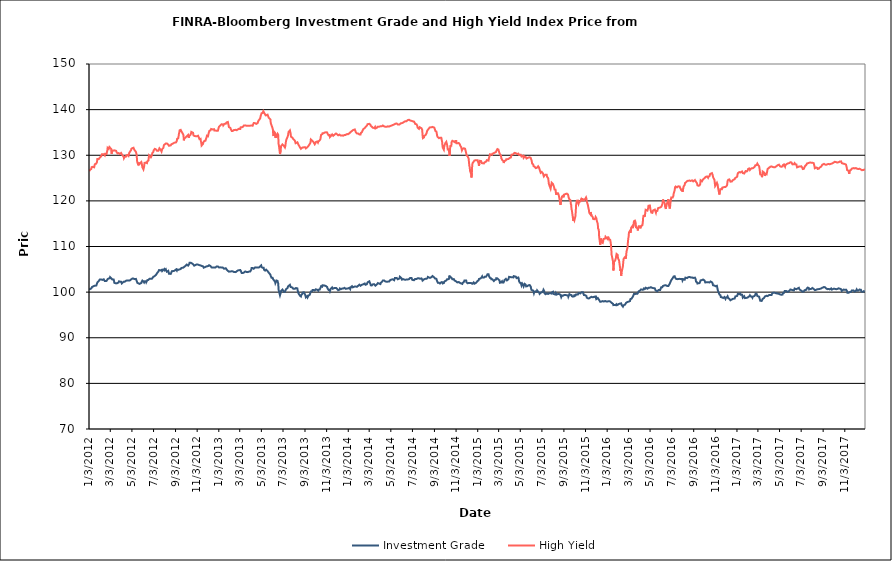
| Category | Investment Grade | High Yield |
|---|---|---|
| 1/3/12 | 100.742 | 126.521 |
| 1/4/12 | 100.597 | 126.529 |
| 1/5/12 | 100.548 | 126.663 |
| 1/6/12 | 100.672 | 126.824 |
| 1/9/12 | 100.818 | 127.016 |
| 1/10/12 | 100.91 | 127.393 |
| 1/11/12 | 101.119 | 127.414 |
| 1/12/12 | 101.246 | 127.571 |
| 1/13/12 | 101.324 | 127.463 |
| 1/17/12 | 101.365 | 127.36 |
| 1/18/12 | 101.455 | 127.435 |
| 1/19/12 | 101.448 | 128.026 |
| 1/20/12 | 101.421 | 128.07 |
| 1/23/12 | 101.433 | 128.175 |
| 1/24/12 | 101.349 | 128.221 |
| 1/25/12 | 101.65 | 128.487 |
| 1/26/12 | 102.102 | 129.167 |
| 1/27/12 | 102.266 | 129.213 |
| 1/30/12 | 102.431 | 129.164 |
| 1/31/12 | 102.58 | 129.039 |
| 2/1/12 | 102.574 | 129.405 |
| 2/2/12 | 102.767 | 129.511 |
| 2/3/12 | 102.65 | 129.574 |
| 2/6/12 | 102.774 | 129.798 |
| 2/7/12 | 102.668 | 129.809 |
| 2/8/12 | 102.826 | 130.217 |
| 2/9/12 | 102.679 | 130.377 |
| 2/10/12 | 102.743 | 130.002 |
| 2/13/12 | 102.811 | 130.239 |
| 2/14/12 | 102.821 | 130.083 |
| 2/15/12 | 102.83 | 130.106 |
| 2/16/12 | 102.429 | 129.967 |
| 2/17/12 | 102.479 | 130.307 |
| 2/21/12 | 102.463 | 130.284 |
| 2/22/12 | 102.57 | 130.67 |
| 2/23/12 | 102.664 | 130.956 |
| 2/24/12 | 102.855 | 131.597 |
| 2/27/12 | 103.004 | 131.368 |
| 2/28/12 | 103.144 | 131.529 |
| 2/29/12 | 103.205 | 131.808 |
| 3/1/12 | 103.025 | 131.852 |
| 3/2/12 | 103.284 | 131.736 |
| 3/5/12 | 103.056 | 131.389 |
| 3/6/12 | 102.929 | 130.339 |
| 3/7/12 | 102.889 | 130.576 |
| 3/8/12 | 102.775 | 130.669 |
| 3/9/12 | 102.69 | 131.049 |
| 3/12/12 | 102.756 | 131.049 |
| 3/13/12 | 102.485 | 131.146 |
| 3/14/12 | 102.022 | 131.244 |
| 3/15/12 | 101.978 | 131.069 |
| 3/16/12 | 102.017 | 131.099 |
| 3/19/12 | 101.918 | 130.958 |
| 3/20/12 | 101.786 | 130.727 |
| 3/21/12 | 102.027 | 130.902 |
| 3/22/12 | 101.958 | 130.559 |
| 3/23/12 | 102.123 | 130.411 |
| 3/26/12 | 102.121 | 130.481 |
| 3/27/12 | 102.364 | 130.583 |
| 3/28/12 | 102.343 | 130.551 |
| 3/29/12 | 102.348 | 130.289 |
| 3/30/12 | 102.304 | 130.504 |
| 4/2/12 | 102.275 | 130.507 |
| 4/3/12 | 102.178 | 130.54 |
| 4/4/12 | 101.896 | 130.313 |
| 4/5/12 | 101.959 | 130.066 |
| 4/9/12 | 102.29 | 129.724 |
| 4/10/12 | 102.336 | 129.341 |
| 4/11/12 | 102.227 | 129.316 |
| 4/12/12 | 102.258 | 129.646 |
| 4/13/12 | 102.438 | 129.816 |
| 4/16/12 | 102.512 | 129.715 |
| 4/17/12 | 102.447 | 129.998 |
| 4/18/12 | 102.478 | 130.062 |
| 4/19/12 | 102.542 | 130 |
| 4/20/12 | 102.456 | 130.072 |
| 4/23/12 | 102.528 | 129.844 |
| 4/24/12 | 102.45 | 130.122 |
| 4/25/12 | 102.376 | 130.54 |
| 4/26/12 | 102.526 | 130.61 |
| 4/27/12 | 102.624 | 130.774 |
| 4/30/12 | 102.764 | 131.097 |
| 5/1/12 | 102.747 | 131.422 |
| 5/2/12 | 102.891 | 131.549 |
| 5/3/12 | 102.958 | 131.559 |
| 5/4/12 | 103.036 | 131.564 |
| 5/7/12 | 102.967 | 131.646 |
| 5/8/12 | 103.069 | 131.43 |
| 5/9/12 | 102.922 | 131.22 |
| 5/10/12 | 102.853 | 131.368 |
| 5/11/12 | 102.937 | 131.343 |
| 5/14/12 | 102.896 | 130.719 |
| 5/15/12 | 102.777 | 130.618 |
| 5/16/12 | 102.436 | 130.036 |
| 5/17/12 | 102.22 | 128.787 |
| 5/18/12 | 102.02 | 128.397 |
| 5/21/12 | 101.935 | 127.807 |
| 5/22/12 | 101.836 | 128.404 |
| 5/23/12 | 101.909 | 128.029 |
| 5/24/12 | 101.806 | 128.076 |
| 5/25/12 | 101.934 | 128.245 |
| 5/29/12 | 102 | 128.512 |
| 5/30/12 | 102.241 | 128.252 |
| 5/31/12 | 102.454 | 128.088 |
| 6/1/12 | 102.529 | 127.354 |
| 6/4/12 | 102.342 | 126.898 |
| 6/5/12 | 102.151 | 126.694 |
| 6/6/12 | 102.104 | 127.566 |
| 6/7/12 | 102.302 | 128.314 |
| 6/8/12 | 102.404 | 128.144 |
| 6/11/12 | 102.405 | 128.406 |
| 6/12/12 | 102.158 | 128.202 |
| 6/13/12 | 102.242 | 128.297 |
| 6/14/12 | 102.219 | 128.278 |
| 6/15/12 | 102.624 | 128.671 |
| 6/18/12 | 102.678 | 128.831 |
| 6/19/12 | 102.678 | 129.471 |
| 6/20/12 | 102.731 | 129.982 |
| 6/21/12 | 102.928 | 130.01 |
| 6/22/12 | 102.86 | 129.877 |
| 6/25/12 | 102.926 | 129.569 |
| 6/26/12 | 102.827 | 129.662 |
| 6/27/12 | 102.871 | 129.855 |
| 6/28/12 | 102.95 | 129.949 |
| 6/29/12 | 102.908 | 130.465 |
| 7/2/12 | 103.372 | 130.772 |
| 7/3/12 | 103.438 | 131.071 |
| 7/5/12 | 103.483 | 131.238 |
| 7/6/12 | 103.617 | 131.405 |
| 7/9/12 | 103.743 | 131.298 |
| 7/10/12 | 103.882 | 131.313 |
| 7/11/12 | 103.974 | 131.355 |
| 7/12/12 | 104.078 | 130.988 |
| 7/13/12 | 104.213 | 131.017 |
| 7/16/12 | 104.502 | 130.976 |
| 7/17/12 | 104.542 | 130.994 |
| 7/18/12 | 104.84 | 131.143 |
| 7/19/12 | 104.904 | 131.518 |
| 7/20/12 | 104.869 | 131.357 |
| 7/23/12 | 104.76 | 131.103 |
| 7/24/12 | 104.857 | 130.931 |
| 7/25/12 | 104.856 | 130.805 |
| 7/26/12 | 104.899 | 131.091 |
| 7/27/12 | 104.627 | 131.355 |
| 7/30/12 | 104.84 | 131.604 |
| 7/31/12 | 105.028 | 131.948 |
| 8/1/12 | 104.967 | 132.255 |
| 8/2/12 | 105.058 | 132.124 |
| 8/3/12 | 104.808 | 132.261 |
| 8/6/12 | 105.018 | 132.559 |
| 8/7/12 | 104.746 | 132.745 |
| 8/8/12 | 104.638 | 132.59 |
| 8/9/12 | 104.469 | 132.581 |
| 8/10/12 | 104.646 | 132.362 |
| 8/13/12 | 104.659 | 132.342 |
| 8/14/12 | 104.381 | 132.345 |
| 8/15/12 | 104.02 | 132.073 |
| 8/16/12 | 103.908 | 132.068 |
| 8/17/12 | 103.944 | 132.003 |
| 8/20/12 | 103.998 | 132.164 |
| 8/21/12 | 104.025 | 132.365 |
| 8/22/12 | 104.353 | 132.42 |
| 8/23/12 | 104.574 | 132.471 |
| 8/24/12 | 104.535 | 132.536 |
| 8/27/12 | 104.634 | 132.588 |
| 8/28/12 | 104.679 | 132.662 |
| 8/29/12 | 104.564 | 132.576 |
| 8/30/12 | 104.666 | 132.748 |
| 8/31/12 | 104.854 | 132.757 |
| 9/4/12 | 104.974 | 132.816 |
| 9/5/12 | 104.888 | 132.819 |
| 9/6/12 | 104.737 | 133.125 |
| 9/7/12 | 104.978 | 133.605 |
| 9/10/12 | 104.878 | 133.705 |
| 9/11/12 | 104.922 | 134.088 |
| 9/12/12 | 104.881 | 134.64 |
| 9/13/12 | 104.964 | 134.936 |
| 9/14/12 | 104.926 | 135.468 |
| 9/17/12 | 105.058 | 135.563 |
| 9/18/12 | 105.16 | 135.387 |
| 9/19/12 | 105.306 | 135.375 |
| 9/20/12 | 105.214 | 135.117 |
| 9/21/12 | 105.236 | 135.047 |
| 9/24/12 | 105.353 | 134.578 |
| 9/25/12 | 105.333 | 134.277 |
| 9/26/12 | 105.396 | 133.268 |
| 9/27/12 | 105.535 | 133.642 |
| 9/28/12 | 105.652 | 133.797 |
| 10/1/12 | 105.785 | 133.896 |
| 10/2/12 | 105.876 | 133.835 |
| 10/3/12 | 105.971 | 133.992 |
| 10/4/12 | 106.042 | 134.162 |
| 10/5/12 | 105.919 | 134.321 |
| 10/8/12 | 105.81 | 134.45 |
| 10/9/12 | 105.946 | 134.131 |
| 10/10/12 | 105.923 | 133.801 |
| 10/11/12 | 106.139 | 134.188 |
| 10/12/12 | 106.424 | 134.299 |
| 10/15/12 | 106.445 | 134.521 |
| 10/16/12 | 106.447 | 134.767 |
| 10/17/12 | 106.444 | 135.122 |
| 10/18/12 | 106.326 | 135.204 |
| 10/19/12 | 106.271 | 135.012 |
| 10/22/12 | 106.114 | 134.922 |
| 10/23/12 | 105.996 | 134.365 |
| 10/24/12 | 105.971 | 134.527 |
| 10/25/12 | 105.806 | 134.564 |
| 10/26/12 | 105.938 | 134.21 |
| 10/29/12 | 105.958 | 134.185 |
| 10/30/12 | 105.958 | 134.185 |
| 10/31/12 | 106.102 | 134.104 |
| 11/1/12 | 106.069 | 134.15 |
| 11/2/12 | 106.005 | 134.287 |
| 11/5/12 | 106.032 | 134.281 |
| 11/6/12 | 105.82 | 134.439 |
| 11/7/12 | 105.9 | 133.937 |
| 11/8/12 | 105.923 | 133.875 |
| 11/9/12 | 105.877 | 133.542 |
| 11/12/12 | 105.86 | 133.603 |
| 11/13/12 | 105.873 | 133.044 |
| 11/14/12 | 105.848 | 132.789 |
| 11/15/12 | 105.744 | 132.136 |
| 11/16/12 | 105.693 | 131.979 |
| 11/19/12 | 105.653 | 132.5 |
| 11/20/12 | 105.532 | 132.869 |
| 11/21/12 | 105.358 | 132.945 |
| 11/23/12 | 105.388 | 133.147 |
| 11/26/12 | 105.534 | 133.19 |
| 11/27/12 | 105.586 | 133.501 |
| 11/28/12 | 105.642 | 133.554 |
| 11/29/12 | 105.643 | 133.926 |
| 11/30/12 | 105.715 | 134.285 |
| 12/3/12 | 105.696 | 134.168 |
| 12/4/12 | 105.727 | 134.386 |
| 12/5/12 | 105.874 | 134.874 |
| 12/6/12 | 105.901 | 135.085 |
| 12/7/12 | 105.741 | 135.362 |
| 12/10/12 | 105.722 | 135.452 |
| 12/11/12 | 105.635 | 135.61 |
| 12/12/12 | 105.563 | 135.761 |
| 12/13/12 | 105.422 | 135.826 |
| 12/14/12 | 105.506 | 135.725 |
| 12/17/12 | 105.385 | 135.641 |
| 12/18/12 | 105.191 | 135.742 |
| 12/19/12 | 105.36 | 135.775 |
| 12/20/12 | 105.386 | 135.706 |
| 12/21/12 | 105.493 | 135.434 |
| 12/24/12 | 105.382 | 135.434 |
| 12/26/12 | 105.438 | 135.223 |
| 12/27/12 | 105.63 | 135.36 |
| 12/28/12 | 105.717 | 135.388 |
| 12/31/12 | 105.623 | 135.388 |
| 1/2/13 | 105.494 | 136.004 |
| 1/3/13 | 105.419 | 136.223 |
| 1/4/13 | 105.349 | 136.418 |
| 1/7/13 | 105.428 | 136.539 |
| 1/8/13 | 105.485 | 136.567 |
| 1/9/13 | 105.45 | 136.666 |
| 1/10/13 | 105.382 | 136.791 |
| 1/11/13 | 105.347 | 136.887 |
| 1/14/13 | 105.372 | 136.76 |
| 1/15/13 | 105.348 | 136.538 |
| 1/16/13 | 105.332 | 136.64 |
| 1/17/13 | 105.127 | 136.744 |
| 1/18/13 | 105.195 | 136.872 |
| 1/22/13 | 105.239 | 136.901 |
| 1/23/13 | 105.259 | 137.065 |
| 1/24/13 | 105.154 | 137.18 |
| 1/25/13 | 104.918 | 137.344 |
| 1/28/13 | 104.671 | 137.292 |
| 1/29/13 | 104.628 | 136.915 |
| 1/30/13 | 104.462 | 136.633 |
| 1/31/13 | 104.489 | 136.183 |
| 2/1/13 | 104.509 | 136.3 |
| 2/4/13 | 104.516 | 135.996 |
| 2/5/13 | 104.38 | 135.778 |
| 2/6/13 | 104.452 | 135.607 |
| 2/7/13 | 104.557 | 135.447 |
| 2/8/13 | 104.482 | 135.313 |
| 2/11/13 | 104.548 | 135.322 |
| 2/12/13 | 104.435 | 135.393 |
| 2/13/13 | 104.331 | 135.446 |
| 2/14/13 | 104.432 | 135.524 |
| 2/15/13 | 104.394 | 135.504 |
| 2/19/13 | 104.387 | 135.572 |
| 2/20/13 | 104.348 | 135.627 |
| 2/21/13 | 104.499 | 135.402 |
| 2/22/13 | 104.557 | 135.485 |
| 2/25/13 | 104.756 | 135.664 |
| 2/26/13 | 104.841 | 135.55 |
| 2/27/13 | 104.778 | 135.597 |
| 2/28/13 | 104.777 | 135.799 |
| 3/1/13 | 104.858 | 135.684 |
| 3/4/13 | 104.85 | 135.753 |
| 3/5/13 | 104.754 | 136.111 |
| 3/6/13 | 104.599 | 136.122 |
| 3/7/13 | 104.412 | 136.133 |
| 3/8/13 | 104.18 | 136.117 |
| 3/11/13 | 104.184 | 136.2 |
| 3/12/13 | 104.331 | 136.304 |
| 3/13/13 | 104.278 | 136.283 |
| 3/14/13 | 104.276 | 136.504 |
| 3/15/13 | 104.401 | 136.543 |
| 3/18/13 | 104.535 | 136.549 |
| 3/19/13 | 104.67 | 136.561 |
| 3/20/13 | 104.466 | 136.574 |
| 3/21/13 | 104.428 | 136.487 |
| 3/22/13 | 104.404 | 136.502 |
| 3/25/13 | 104.386 | 136.448 |
| 3/26/13 | 104.316 | 136.408 |
| 3/27/13 | 104.488 | 136.442 |
| 3/28/13 | 104.489 | 136.483 |
| 4/1/13 | 104.516 | 136.479 |
| 4/2/13 | 104.463 | 136.55 |
| 4/3/13 | 104.642 | 136.537 |
| 4/4/13 | 104.92 | 136.53 |
| 4/5/13 | 105.293 | 136.496 |
| 4/8/13 | 105.29 | 136.464 |
| 4/9/13 | 105.304 | 136.717 |
| 4/10/13 | 105.125 | 136.822 |
| 4/11/13 | 105.12 | 137.05 |
| 4/12/13 | 105.316 | 137.192 |
| 4/15/13 | 105.424 | 137.038 |
| 4/16/13 | 105.369 | 137.111 |
| 4/17/13 | 105.389 | 136.936 |
| 4/18/13 | 105.407 | 136.862 |
| 4/19/13 | 105.346 | 136.955 |
| 4/22/13 | 105.406 | 137.056 |
| 4/23/13 | 105.46 | 137.317 |
| 4/24/13 | 105.498 | 137.459 |
| 4/25/13 | 105.38 | 137.639 |
| 4/26/13 | 105.595 | 137.856 |
| 4/29/13 | 105.615 | 138.038 |
| 4/30/13 | 105.612 | 138.388 |
| 5/1/13 | 105.781 | 138.733 |
| 5/2/13 | 105.844 | 138.955 |
| 5/3/13 | 105.494 | 139.201 |
| 5/6/13 | 105.353 | 139.261 |
| 5/7/13 | 105.329 | 139.46 |
| 5/8/13 | 105.359 | 139.652 |
| 5/9/13 | 105.342 | 139.604 |
| 5/10/13 | 104.923 | 139.359 |
| 5/13/13 | 104.727 | 138.947 |
| 5/14/13 | 104.694 | 138.789 |
| 5/15/13 | 104.673 | 138.724 |
| 5/16/13 | 104.927 | 138.831 |
| 5/17/13 | 104.738 | 138.852 |
| 5/20/13 | 104.621 | 138.896 |
| 5/21/13 | 104.661 | 138.85 |
| 5/22/13 | 104.462 | 138.759 |
| 5/23/13 | 104.301 | 138.269 |
| 5/24/13 | 104.298 | 138.075 |
| 5/28/13 | 103.825 | 137.844 |
| 5/29/13 | 103.525 | 137.043 |
| 5/30/13 | 103.475 | 136.973 |
| 5/31/13 | 103.159 | 136.601 |
| 6/3/13 | 103.169 | 135.944 |
| 6/4/13 | 102.987 | 135.582 |
| 6/5/13 | 102.781 | 134.538 |
| 6/6/13 | 102.788 | 134.224 |
| 6/7/13 | 102.678 | 135.191 |
| 6/10/13 | 102.314 | 134.939 |
| 6/11/13 | 101.98 | 133.85 |
| 6/12/13 | 102.018 | 134.087 |
| 6/13/13 | 102.11 | 133.805 |
| 6/14/13 | 102.545 | 134.401 |
| 6/17/13 | 102.474 | 134.746 |
| 6/18/13 | 102.164 | 134.589 |
| 6/19/13 | 101.914 | 134.457 |
| 6/20/13 | 100.588 | 132.485 |
| 6/21/13 | 100.219 | 132.116 |
| 6/24/13 | 99.311 | 130.267 |
| 6/25/13 | 99.469 | 130.422 |
| 6/26/13 | 99.857 | 131.058 |
| 6/27/13 | 100.266 | 131.995 |
| 6/28/13 | 100.357 | 132.199 |
| 7/1/13 | 100.575 | 132.38 |
| 7/2/13 | 100.774 | 132.5 |
| 7/3/13 | 100.789 | 132.233 |
| 7/5/13 | 100.052 | 132.062 |
| 7/8/13 | 100.063 | 131.702 |
| 7/9/13 | 100.261 | 131.99 |
| 7/10/13 | 100.23 | 132.194 |
| 7/11/13 | 100.65 | 133.132 |
| 7/12/13 | 100.778 | 133.422 |
| 7/15/13 | 100.866 | 133.956 |
| 7/16/13 | 101.036 | 134.184 |
| 7/17/13 | 101.286 | 134.476 |
| 7/18/13 | 101.274 | 135.077 |
| 7/19/13 | 101.435 | 135.209 |
| 7/22/13 | 101.6 | 135.45 |
| 7/23/13 | 101.546 | 135.437 |
| 7/24/13 | 101.125 | 134.763 |
| 7/25/13 | 100.927 | 134.065 |
| 7/26/13 | 101.109 | 134.013 |
| 7/29/13 | 101.003 | 133.854 |
| 7/30/13 | 100.974 | 133.888 |
| 7/31/13 | 100.761 | 133.596 |
| 8/1/13 | 100.577 | 133.583 |
| 8/2/13 | 100.839 | 133.403 |
| 8/5/13 | 100.724 | 133.206 |
| 8/6/13 | 100.666 | 132.905 |
| 8/7/13 | 100.771 | 132.644 |
| 8/8/13 | 100.906 | 132.743 |
| 8/9/13 | 100.882 | 132.811 |
| 8/12/13 | 100.814 | 132.845 |
| 8/13/13 | 100.327 | 132.628 |
| 8/14/13 | 100.232 | 132.676 |
| 8/15/13 | 99.756 | 132.339 |
| 8/16/13 | 99.565 | 132.204 |
| 8/19/13 | 99.254 | 131.767 |
| 8/20/13 | 99.406 | 131.634 |
| 8/21/13 | 99.234 | 131.571 |
| 8/22/13 | 99.051 | 131.404 |
| 8/23/13 | 99.367 | 131.617 |
| 8/26/13 | 99.636 | 131.681 |
| 8/27/13 | 99.89 | 131.589 |
| 8/28/13 | 99.751 | 131.599 |
| 8/29/13 | 99.819 | 131.721 |
| 8/30/13 | 99.969 | 131.931 |
| 9/3/13 | 99.443 | 131.767 |
| 9/4/13 | 99.4 | 131.735 |
| 9/5/13 | 98.833 | 131.503 |
| 9/6/13 | 99.036 | 131.534 |
| 9/9/13 | 99.126 | 131.762 |
| 9/10/13 | 98.881 | 131.688 |
| 9/11/13 | 98.985 | 131.774 |
| 9/12/13 | 99.199 | 132.012 |
| 9/13/13 | 99.132 | 132.108 |
| 9/16/13 | 99.445 | 132.49 |
| 9/17/13 | 99.387 | 132.526 |
| 9/18/13 | 99.587 | 132.801 |
| 9/19/13 | 100.13 | 133.454 |
| 9/20/13 | 100.145 | 133.463 |
| 9/23/13 | 100.222 | 133.158 |
| 9/24/13 | 100.458 | 133.178 |
| 9/25/13 | 100.57 | 133.037 |
| 9/26/13 | 100.459 | 132.947 |
| 9/27/13 | 100.477 | 132.761 |
| 9/30/13 | 100.36 | 132.403 |
| 10/1/13 | 100.351 | 132.559 |
| 10/2/13 | 100.5 | 132.65 |
| 10/3/13 | 100.614 | 132.895 |
| 10/4/13 | 100.436 | 132.974 |
| 10/7/13 | 100.499 | 133.004 |
| 10/8/13 | 100.458 | 132.84 |
| 10/9/13 | 100.359 | 132.765 |
| 10/10/13 | 100.309 | 133.012 |
| 10/11/13 | 100.536 | 133.183 |
| 10/14/13 | 100.578 | 133.263 |
| 10/15/13 | 100.404 | 133.285 |
| 10/16/13 | 100.541 | 133.539 |
| 10/17/13 | 101.066 | 134.085 |
| 10/18/13 | 101.3 | 134.484 |
| 10/21/13 | 101.202 | 134.622 |
| 10/22/13 | 101.507 | 134.843 |
| 10/23/13 | 101.575 | 134.752 |
| 10/24/13 | 101.454 | 134.8 |
| 10/25/13 | 101.475 | 134.836 |
| 10/28/13 | 101.432 | 134.984 |
| 10/29/13 | 101.425 | 134.988 |
| 10/30/13 | 101.524 | 135.037 |
| 10/31/13 | 101.352 | 135.022 |
| 11/1/13 | 101.143 | 134.905 |
| 11/4/13 | 101.125 | 135.008 |
| 11/5/13 | 100.846 | 134.753 |
| 11/6/13 | 100.906 | 134.761 |
| 11/7/13 | 100.99 | 134.746 |
| 11/8/13 | 100.473 | 134.373 |
| 11/11/13 | 100.506 | 134.437 |
| 11/12/13 | 100.257 | 134.002 |
| 11/13/13 | 100.423 | 133.829 |
| 11/14/13 | 100.717 | 134.11 |
| 11/15/13 | 100.772 | 134.271 |
| 11/18/13 | 101.031 | 134.561 |
| 11/19/13 | 100.928 | 134.495 |
| 11/20/13 | 100.749 | 134.418 |
| 11/21/13 | 100.578 | 134.251 |
| 11/22/13 | 100.784 | 134.462 |
| 11/25/13 | 100.926 | 134.532 |
| 11/26/13 | 101.066 | 134.489 |
| 11/27/13 | 100.968 | 134.694 |
| 11/29/13 | 100.926 | 134.769 |
| 12/2/13 | 100.715 | 134.59 |
| 12/3/13 | 100.783 | 134.592 |
| 12/4/13 | 100.522 | 134.448 |
| 12/5/13 | 100.422 | 134.378 |
| 12/6/13 | 100.434 | 134.486 |
| 12/9/13 | 100.55 | 134.531 |
| 12/10/13 | 100.804 | 134.606 |
| 12/11/13 | 100.783 | 134.549 |
| 12/12/13 | 100.616 | 134.316 |
| 12/13/13 | 100.656 | 134.34 |
| 12/16/13 | 100.77 | 134.355 |
| 12/17/13 | 100.883 | 134.318 |
| 12/18/13 | 100.862 | 134.256 |
| 12/19/13 | 100.784 | 134.28 |
| 12/20/13 | 100.91 | 134.382 |
| 12/23/13 | 100.94 | 134.459 |
| 12/24/13 | 100.826 | 134.433 |
| 12/26/13 | 100.715 | 134.462 |
| 12/27/13 | 100.661 | 134.544 |
| 12/30/13 | 100.78 | 134.644 |
| 12/31/13 | 100.835 | 134.665 |
| 1/2/14 | 100.818 | 134.61 |
| 1/3/14 | 100.821 | 134.675 |
| 1/6/14 | 100.947 | 134.841 |
| 1/7/14 | 100.979 | 135.053 |
| 1/8/14 | 100.662 | 135.04 |
| 1/9/14 | 100.703 | 135.072 |
| 1/10/14 | 101.104 | 135.228 |
| 1/13/14 | 101.302 | 135.332 |
| 1/14/14 | 101.168 | 135.33 |
| 1/15/14 | 101.05 | 135.493 |
| 1/16/14 | 101.186 | 135.513 |
| 1/17/14 | 101.214 | 135.694 |
| 1/21/14 | 101.237 | 135.657 |
| 1/22/14 | 101.077 | 135.696 |
| 1/23/14 | 101.165 | 135.526 |
| 1/24/14 | 101.225 | 135.025 |
| 1/27/14 | 101.165 | 134.766 |
| 1/28/14 | 101.185 | 134.798 |
| 1/29/14 | 101.336 | 134.736 |
| 1/30/14 | 101.366 | 134.782 |
| 1/31/14 | 101.431 | 134.664 |
| 2/3/14 | 101.636 | 134.541 |
| 2/4/14 | 101.583 | 134.457 |
| 2/5/14 | 101.42 | 134.361 |
| 2/6/14 | 101.393 | 134.536 |
| 2/7/14 | 101.592 | 134.888 |
| 2/10/14 | 101.615 | 135.076 |
| 2/11/14 | 101.498 | 135.216 |
| 2/12/14 | 101.418 | 135.441 |
| 2/13/14 | 101.69 | 135.543 |
| 2/14/14 | 101.753 | 135.746 |
| 2/18/14 | 101.892 | 135.952 |
| 2/19/14 | 101.879 | 136.044 |
| 2/20/14 | 101.613 | 136.097 |
| 2/21/14 | 101.699 | 136.258 |
| 2/24/14 | 101.732 | 136.482 |
| 2/25/14 | 101.989 | 136.691 |
| 2/26/14 | 102.079 | 136.809 |
| 2/27/14 | 102.222 | 136.918 |
| 2/28/14 | 102.211 | 137.009 |
| 3/3/14 | 102.364 | 136.884 |
| 3/4/14 | 102.118 | 136.915 |
| 3/5/14 | 102.048 | 136.916 |
| 3/6/14 | 101.816 | 136.684 |
| 3/7/14 | 101.497 | 136.459 |
| 3/10/14 | 101.461 | 136.253 |
| 3/11/14 | 101.46 | 136.252 |
| 3/12/14 | 101.557 | 136.142 |
| 3/13/14 | 101.718 | 136.026 |
| 3/14/14 | 101.769 | 135.809 |
| 3/17/14 | 101.717 | 135.965 |
| 3/18/14 | 101.749 | 136.072 |
| 3/19/14 | 101.649 | 136.191 |
| 3/20/14 | 101.412 | 135.875 |
| 3/21/14 | 101.566 | 136.086 |
| 3/24/14 | 101.667 | 136.015 |
| 3/25/14 | 101.737 | 136.04 |
| 3/26/14 | 101.878 | 136.252 |
| 3/27/14 | 101.987 | 136.119 |
| 3/28/14 | 101.878 | 136.233 |
| 3/31/14 | 101.852 | 136.266 |
| 4/1/14 | 101.868 | 136.261 |
| 4/2/14 | 101.643 | 136.321 |
| 4/3/14 | 101.764 | 136.337 |
| 4/4/14 | 102.025 | 136.448 |
| 4/7/14 | 102.21 | 136.349 |
| 4/8/14 | 102.242 | 136.393 |
| 4/9/14 | 102.266 | 136.486 |
| 4/10/14 | 102.532 | 136.521 |
| 4/11/14 | 102.573 | 136.311 |
| 4/14/14 | 102.531 | 136.308 |
| 4/15/14 | 102.544 | 136.227 |
| 4/16/14 | 102.487 | 136.253 |
| 4/17/14 | 102.346 | 136.257 |
| 4/21/14 | 102.277 | 136.247 |
| 4/22/14 | 102.207 | 136.279 |
| 4/23/14 | 102.343 | 136.332 |
| 4/24/14 | 102.303 | 136.334 |
| 4/25/14 | 102.421 | 136.355 |
| 4/28/14 | 102.328 | 136.308 |
| 4/29/14 | 102.243 | 136.341 |
| 4/30/14 | 102.413 | 136.464 |
| 5/1/14 | 102.654 | 136.42 |
| 5/2/14 | 102.735 | 136.585 |
| 5/5/14 | 102.752 | 136.518 |
| 5/6/14 | 102.75 | 136.554 |
| 5/7/14 | 102.757 | 136.59 |
| 5/8/14 | 102.825 | 136.629 |
| 5/9/14 | 102.765 | 136.738 |
| 5/12/14 | 102.608 | 136.757 |
| 5/13/14 | 102.76 | 136.86 |
| 5/14/14 | 103.095 | 136.951 |
| 5/15/14 | 103.233 | 136.892 |
| 5/16/14 | 103.154 | 136.848 |
| 5/19/14 | 103.118 | 136.968 |
| 5/20/14 | 103.068 | 136.874 |
| 5/21/14 | 102.909 | 136.849 |
| 5/22/14 | 102.817 | 136.739 |
| 5/23/14 | 102.956 | 136.771 |
| 5/27/14 | 102.996 | 136.726 |
| 5/28/14 | 103.368 | 136.78 |
| 5/29/14 | 103.4 | 136.844 |
| 5/30/14 | 103.25 | 136.989 |
| 6/2/14 | 102.997 | 137.03 |
| 6/3/14 | 102.747 | 136.843 |
| 6/4/14 | 102.639 | 136.861 |
| 6/5/14 | 102.724 | 137.095 |
| 6/6/14 | 102.858 | 137.239 |
| 6/9/14 | 102.774 | 137.321 |
| 6/10/14 | 102.652 | 137.409 |
| 6/11/14 | 102.666 | 137.46 |
| 6/12/14 | 102.706 | 137.448 |
| 6/13/14 | 102.744 | 137.427 |
| 6/16/14 | 102.763 | 137.473 |
| 6/17/14 | 102.566 | 137.403 |
| 6/18/14 | 102.647 | 137.424 |
| 6/19/14 | 102.775 | 137.698 |
| 6/20/14 | 102.697 | 137.723 |
| 6/23/14 | 102.846 | 137.779 |
| 6/24/14 | 102.88 | 137.797 |
| 6/25/14 | 103.059 | 137.699 |
| 6/26/14 | 103.117 | 137.613 |
| 6/27/14 | 103.111 | 137.582 |
| 6/30/14 | 103.096 | 137.543 |
| 7/1/14 | 102.92 | 137.521 |
| 7/2/14 | 102.692 | 137.487 |
| 7/3/14 | 102.53 | 137.445 |
| 7/7/14 | 102.607 | 137.369 |
| 7/8/14 | 102.82 | 137.259 |
| 7/9/14 | 102.778 | 137.102 |
| 7/10/14 | 102.892 | 136.873 |
| 7/11/14 | 102.97 | 136.858 |
| 7/14/14 | 102.883 | 136.783 |
| 7/15/14 | 102.808 | 136.662 |
| 7/16/14 | 102.837 | 136.489 |
| 7/17/14 | 103.023 | 136.093 |
| 7/18/14 | 102.976 | 135.884 |
| 7/21/14 | 103.018 | 135.786 |
| 7/22/14 | 103.027 | 135.911 |
| 7/23/14 | 103.133 | 136.146 |
| 7/24/14 | 102.926 | 136.135 |
| 7/25/14 | 103.053 | 136.103 |
| 7/28/14 | 103.005 | 135.916 |
| 7/29/14 | 103.084 | 135.842 |
| 7/30/14 | 102.775 | 135.555 |
| 7/31/14 | 102.536 | 134.442 |
| 8/1/14 | 102.65 | 133.751 |
| 8/4/14 | 102.794 | 133.906 |
| 8/5/14 | 102.693 | 134.262 |
| 8/6/14 | 102.743 | 134.202 |
| 8/7/14 | 102.903 | 134.308 |
| 8/8/14 | 103.015 | 134.39 |
| 8/11/14 | 102.911 | 134.76 |
| 8/12/14 | 102.848 | 134.962 |
| 8/13/14 | 102.947 | 135.352 |
| 8/14/14 | 103.093 | 135.465 |
| 8/15/14 | 103.336 | 135.579 |
| 8/18/14 | 103.224 | 135.868 |
| 8/19/14 | 103.166 | 136.06 |
| 8/20/14 | 103.049 | 136.102 |
| 8/21/14 | 103.116 | 136.129 |
| 8/22/14 | 103.16 | 136.109 |
| 8/25/14 | 103.266 | 136.118 |
| 8/26/14 | 103.305 | 136.212 |
| 8/27/14 | 103.386 | 136.164 |
| 8/28/14 | 103.533 | 136.214 |
| 8/29/14 | 103.569 | 136.23 |
| 9/2/14 | 103.224 | 136.057 |
| 9/3/14 | 103.152 | 135.89 |
| 9/4/14 | 102.992 | 135.641 |
| 9/5/14 | 102.979 | 135.338 |
| 9/8/14 | 102.91 | 135.188 |
| 9/9/14 | 102.636 | 134.826 |
| 9/10/14 | 102.415 | 134.318 |
| 9/11/14 | 102.404 | 134.077 |
| 9/12/14 | 102.066 | 133.947 |
| 9/15/14 | 102.058 | 133.746 |
| 9/16/14 | 102.079 | 133.58 |
| 9/17/14 | 102.06 | 133.729 |
| 9/18/14 | 101.895 | 133.842 |
| 9/19/14 | 102.051 | 133.984 |
| 9/22/14 | 102.194 | 133.817 |
| 9/23/14 | 102.265 | 133.321 |
| 9/24/14 | 102.135 | 133.064 |
| 9/25/14 | 102.162 | 132.238 |
| 9/26/14 | 101.911 | 131.656 |
| 9/29/14 | 101.987 | 131.223 |
| 9/30/14 | 101.995 | 131.89 |
| 10/1/14 | 102.349 | 132.149 |
| 10/2/14 | 102.373 | 132.201 |
| 10/3/14 | 102.345 | 132.64 |
| 10/6/14 | 102.56 | 132.946 |
| 10/7/14 | 102.76 | 132.603 |
| 10/8/14 | 102.816 | 132.383 |
| 10/9/14 | 102.873 | 131.878 |
| 10/10/14 | 102.843 | 131.266 |
| 10/13/14 | 102.861 | 131.314 |
| 10/14/14 | 103.153 | 130.54 |
| 10/15/14 | 103.63 | 129.86 |
| 10/16/14 | 103.21 | 130.301 |
| 10/17/14 | 103.149 | 132.001 |
| 10/20/14 | 103.206 | 132.057 |
| 10/21/14 | 103.156 | 132.922 |
| 10/22/14 | 103.063 | 133.044 |
| 10/23/14 | 102.823 | 133.165 |
| 10/24/14 | 102.843 | 133.183 |
| 10/27/14 | 102.852 | 132.995 |
| 10/28/14 | 102.764 | 133.102 |
| 10/29/14 | 102.545 | 132.948 |
| 10/30/14 | 102.596 | 132.859 |
| 10/31/14 | 102.445 | 133.107 |
| 11/3/14 | 102.344 | 133.133 |
| 11/4/14 | 102.35 | 132.642 |
| 11/5/14 | 102.221 | 132.701 |
| 11/6/14 | 102.127 | 132.705 |
| 11/7/14 | 102.255 | 132.638 |
| 11/10/14 | 102.218 | 132.691 |
| 11/11/14 | 102.225 | 132.81 |
| 11/12/14 | 102.112 | 132.619 |
| 11/13/14 | 102.052 | 132.412 |
| 11/14/14 | 102.008 | 132.145 |
| 11/17/14 | 101.894 | 131.772 |
| 11/18/14 | 101.843 | 131.427 |
| 11/19/14 | 101.695 | 131.083 |
| 11/20/14 | 101.809 | 131.09 |
| 11/21/14 | 102.03 | 131.414 |
| 11/24/14 | 102.171 | 131.531 |
| 11/25/14 | 102.338 | 131.588 |
| 11/26/14 | 102.539 | 131.644 |
| 11/28/14 | 102.655 | 131.425 |
| 12/1/14 | 102.559 | 130.466 |
| 12/2/14 | 102.141 | 129.983 |
| 12/3/14 | 102.081 | 130.038 |
| 12/4/14 | 102.177 | 129.993 |
| 12/5/14 | 101.947 | 129.782 |
| 12/8/14 | 101.994 | 129.233 |
| 12/9/14 | 102.101 | 128.353 |
| 12/10/14 | 102.099 | 127.663 |
| 12/11/14 | 102.021 | 127.356 |
| 12/12/14 | 102.212 | 126.57 |
| 12/15/14 | 101.978 | 125.84 |
| 12/16/14 | 101.885 | 125.12 |
| 12/17/14 | 101.994 | 126.235 |
| 12/18/14 | 101.843 | 127.8 |
| 12/19/14 | 102.027 | 128.272 |
| 12/22/14 | 102.137 | 128.584 |
| 12/23/14 | 102.011 | 128.794 |
| 12/24/14 | 101.848 | 128.833 |
| 12/26/14 | 101.905 | 128.825 |
| 12/29/14 | 102.054 | 128.921 |
| 12/30/14 | 102.239 | 128.765 |
| 12/31/14 | 102.233 | 128.769 |
| 1/2/15 | 102.426 | 128.911 |
| 1/5/15 | 102.586 | 128.223 |
| 1/6/15 | 102.878 | 127.662 |
| 1/7/15 | 102.893 | 128.095 |
| 1/8/15 | 102.797 | 128.789 |
| 1/9/15 | 102.956 | 128.868 |
| 1/12/15 | 103.094 | 128.728 |
| 1/13/15 | 103.116 | 128.583 |
| 1/14/15 | 103.282 | 128.28 |
| 1/15/15 | 103.445 | 128.444 |
| 1/16/15 | 103.218 | 128.331 |
| 1/20/15 | 103.176 | 128.203 |
| 1/21/15 | 103.074 | 128.203 |
| 1/22/15 | 102.998 | 128.455 |
| 1/23/15 | 103.395 | 128.628 |
| 1/26/15 | 103.388 | 128.595 |
| 1/27/15 | 103.486 | 128.767 |
| 1/28/15 | 103.616 | 128.923 |
| 1/29/15 | 103.575 | 128.896 |
| 1/30/15 | 103.915 | 128.884 |
| 2/2/15 | 103.902 | 128.826 |
| 2/3/15 | 103.611 | 129.307 |
| 2/4/15 | 103.464 | 129.573 |
| 2/5/15 | 103.571 | 129.826 |
| 2/6/15 | 103.134 | 130.204 |
| 2/9/15 | 103.034 | 130.169 |
| 2/10/15 | 102.809 | 130.199 |
| 2/11/15 | 102.739 | 130.053 |
| 2/12/15 | 102.846 | 130.105 |
| 2/13/15 | 102.803 | 130.334 |
| 2/17/15 | 102.437 | 130.465 |
| 2/18/15 | 102.543 | 130.673 |
| 2/19/15 | 102.623 | 130.581 |
| 2/20/15 | 102.701 | 130.602 |
| 2/23/15 | 102.76 | 130.717 |
| 2/24/15 | 103.054 | 130.904 |
| 2/25/15 | 103.205 | 131.093 |
| 2/26/15 | 103.084 | 131.259 |
| 2/27/15 | 103.014 | 131.346 |
| 3/2/15 | 102.766 | 131.232 |
| 3/3/15 | 102.641 | 131.019 |
| 3/4/15 | 102.55 | 130.662 |
| 3/5/15 | 102.571 | 130.64 |
| 3/6/15 | 102.05 | 130.229 |
| 3/9/15 | 102.107 | 129.958 |
| 3/10/15 | 102.236 | 129.348 |
| 3/11/15 | 102.218 | 129.308 |
| 3/12/15 | 102.373 | 129.437 |
| 3/13/15 | 102.12 | 128.915 |
| 3/16/15 | 102.092 | 128.692 |
| 3/17/15 | 102.088 | 128.301 |
| 3/18/15 | 102.392 | 128.399 |
| 3/19/15 | 102.637 | 128.765 |
| 3/20/15 | 102.778 | 128.818 |
| 3/23/15 | 102.9 | 128.891 |
| 3/24/15 | 103.067 | 129.136 |
| 3/25/15 | 102.948 | 129.155 |
| 3/26/15 | 102.572 | 129.012 |
| 3/27/15 | 102.722 | 129.135 |
| 3/30/15 | 102.816 | 129.18 |
| 3/31/15 | 102.97 | 129.203 |
| 4/1/15 | 103.346 | 129.242 |
| 4/2/15 | 103.283 | 129.384 |
| 4/6/15 | 103.281 | 129.514 |
| 4/7/15 | 103.339 | 129.813 |
| 4/8/15 | 103.385 | 130.12 |
| 4/9/15 | 103.25 | 130.08 |
| 4/10/15 | 103.269 | 130.183 |
| 4/13/15 | 103.225 | 130.222 |
| 4/14/15 | 103.502 | 130.217 |
| 4/15/15 | 103.476 | 130.43 |
| 4/16/15 | 103.412 | 130.52 |
| 4/17/15 | 103.448 | 130.393 |
| 4/20/15 | 103.374 | 130.451 |
| 4/21/15 | 103.344 | 130.415 |
| 4/22/15 | 103.073 | 130.258 |
| 4/23/15 | 103.075 | 130.272 |
| 4/24/15 | 103.252 | 130.37 |
| 4/27/15 | 103.2 | 130.372 |
| 4/28/15 | 102.95 | 130.305 |
| 4/29/15 | 102.411 | 130.069 |
| 4/30/15 | 102.251 | 129.999 |
| 5/1/15 | 102.081 | 130.001 |
| 5/4/15 | 101.991 | 130.107 |
| 5/5/15 | 101.745 | 130.012 |
| 5/6/15 | 101.469 | 129.725 |
| 5/7/15 | 101.552 | 129.512 |
| 5/8/15 | 101.879 | 129.87 |
| 5/11/15 | 101.525 | 129.898 |
| 5/12/15 | 101.269 | 129.438 |
| 5/13/15 | 101.316 | 129.534 |
| 5/14/15 | 101.397 | 129.569 |
| 5/15/15 | 101.81 | 129.716 |
| 5/18/15 | 101.582 | 129.614 |
| 5/19/15 | 101.262 | 129.456 |
| 5/20/15 | 101.187 | 129.294 |
| 5/21/15 | 101.333 | 129.372 |
| 5/22/15 | 101.31 | 129.503 |
| 5/26/15 | 101.519 | 129.524 |
| 5/27/15 | 101.506 | 129.504 |
| 5/28/15 | 101.507 | 129.417 |
| 5/29/15 | 101.544 | 129.539 |
| 6/1/15 | 101.222 | 129.422 |
| 6/2/15 | 100.801 | 129.253 |
| 6/3/15 | 100.493 | 128.955 |
| 6/4/15 | 100.607 | 128.669 |
| 6/5/15 | 100.338 | 128.185 |
| 6/8/15 | 100.328 | 127.981 |
| 6/9/15 | 100.063 | 127.603 |
| 6/10/15 | 99.766 | 127.441 |
| 6/11/15 | 100.019 | 127.722 |
| 6/12/15 | 100.209 | 127.509 |
| 6/15/15 | 100.183 | 127.18 |
| 6/16/15 | 100.204 | 127.036 |
| 6/17/15 | 100.102 | 127.086 |
| 6/18/15 | 100.13 | 127.235 |
| 6/19/15 | 100.39 | 127.422 |
| 6/22/15 | 100.096 | 127.586 |
| 6/23/15 | 99.909 | 127.511 |
| 6/24/15 | 99.918 | 127.359 |
| 6/25/15 | 99.854 | 127.195 |
| 6/26/15 | 99.62 | 126.893 |
| 6/29/15 | 99.884 | 126.158 |
| 6/30/15 | 100.037 | 126.2 |
| 7/1/15 | 99.808 | 126.273 |
| 7/2/15 | 99.959 | 126.354 |
| 7/6/15 | 100.232 | 125.966 |
| 7/7/15 | 100.504 | 125.596 |
| 7/8/15 | 100.46 | 125.367 |
| 7/9/15 | 100.206 | 125.508 |
| 7/10/15 | 99.759 | 125.61 |
| 7/13/15 | 99.543 | 125.751 |
| 7/14/15 | 99.576 | 125.717 |
| 7/15/15 | 99.661 | 125.833 |
| 7/16/15 | 99.721 | 125.742 |
| 7/17/15 | 99.787 | 125.286 |
| 7/20/15 | 99.6 | 124.999 |
| 7/21/15 | 99.649 | 124.522 |
| 7/22/15 | 99.72 | 123.795 |
| 7/23/15 | 99.744 | 123.523 |
| 7/24/15 | 99.803 | 123.3 |
| 7/27/15 | 99.786 | 122.67 |
| 7/28/15 | 99.739 | 122.649 |
| 7/29/15 | 99.618 | 123.461 |
| 7/30/15 | 99.685 | 123.964 |
| 7/31/15 | 99.954 | 123.922 |
| 8/3/15 | 100.094 | 123.653 |
| 8/4/15 | 99.962 | 123.719 |
| 8/5/15 | 99.584 | 123.491 |
| 8/6/15 | 99.586 | 122.954 |
| 8/7/15 | 99.668 | 122.503 |
| 8/10/15 | 99.471 | 122.46 |
| 8/11/15 | 99.769 | 121.721 |
| 8/12/15 | 99.692 | 121.342 |
| 8/13/15 | 99.468 | 121.66 |
| 8/14/15 | 99.448 | 121.642 |
| 8/17/15 | 99.602 | 121.654 |
| 8/18/15 | 99.477 | 121.633 |
| 8/19/15 | 99.424 | 121.252 |
| 8/20/15 | 99.586 | 120.824 |
| 8/21/15 | 99.626 | 120.461 |
| 8/24/15 | 99.414 | 119.113 |
| 8/25/15 | 99.195 | 119.971 |
| 8/26/15 | 98.899 | 119.946 |
| 8/27/15 | 99.074 | 120.628 |
| 8/28/15 | 99.244 | 120.939 |
| 8/31/15 | 99.217 | 121.131 |
| 9/1/15 | 99.152 | 120.781 |
| 9/2/15 | 99.203 | 120.942 |
| 9/3/15 | 99.347 | 121.372 |
| 9/4/15 | 99.526 | 121.243 |
| 9/8/15 | 99.36 | 121.524 |
| 9/9/15 | 99.315 | 121.732 |
| 9/10/15 | 99.219 | 121.563 |
| 9/11/15 | 99.299 | 121.587 |
| 9/14/15 | 99.28 | 121.4 |
| 9/15/15 | 98.987 | 121.19 |
| 9/16/15 | 98.862 | 120.73 |
| 9/17/15 | 99.061 | 120.585 |
| 9/18/15 | 99.563 | 120.333 |
| 9/21/15 | 99.399 | 120.151 |
| 9/22/15 | 99.494 | 119.36 |
| 9/23/15 | 99.371 | 119.122 |
| 9/24/15 | 99.35 | 118.157 |
| 9/25/15 | 99.1 | 117.905 |
| 9/28/15 | 99.012 | 116.226 |
| 9/29/15 | 98.984 | 115.614 |
| 9/30/15 | 99.07 | 116.002 |
| 10/1/15 | 99.06 | 115.948 |
| 10/2/15 | 99.323 | 115.684 |
| 10/5/15 | 99.23 | 116.623 |
| 10/6/15 | 99.352 | 117.736 |
| 10/7/15 | 99.51 | 119.116 |
| 10/8/15 | 99.412 | 119.115 |
| 10/9/15 | 99.403 | 120.047 |
| 10/12/15 | 99.475 | 120.06 |
| 10/13/15 | 99.568 | 119.722 |
| 10/14/15 | 99.799 | 119.376 |
| 10/15/15 | 99.747 | 119.342 |
| 10/16/15 | 99.774 | 119.841 |
| 10/19/15 | 99.716 | 119.878 |
| 10/20/15 | 99.599 | 120.046 |
| 10/21/15 | 99.843 | 120.27 |
| 10/22/15 | 99.962 | 120.041 |
| 10/23/15 | 99.839 | 120.443 |
| 10/26/15 | 99.988 | 120.39 |
| 10/27/15 | 100.024 | 120.083 |
| 10/28/15 | 99.784 | 120.133 |
| 10/29/15 | 99.366 | 120.237 |
| 10/30/15 | 99.366 | 120.195 |
| 11/2/15 | 99.31 | 120.487 |
| 11/3/15 | 99.232 | 120.637 |
| 11/4/15 | 99.181 | 120.753 |
| 11/5/15 | 99.133 | 120.502 |
| 11/6/15 | 98.802 | 119.883 |
| 11/9/15 | 98.639 | 119.13 |
| 11/10/15 | 98.69 | 118.692 |
| 11/11/15 | 98.74 | 118.736 |
| 11/12/15 | 98.611 | 118.014 |
| 11/13/15 | 98.747 | 117.394 |
| 11/16/15 | 98.823 | 117.075 |
| 11/17/15 | 98.766 | 117.548 |
| 11/18/15 | 98.769 | 117.423 |
| 11/19/15 | 98.972 | 116.89 |
| 11/20/15 | 98.935 | 116.829 |
| 11/23/15 | 98.87 | 116.393 |
| 11/24/15 | 98.906 | 116.043 |
| 11/25/15 | 98.93 | 116.051 |
| 11/27/15 | 98.976 | 115.977 |
| 11/30/15 | 98.929 | 116.132 |
| 12/1/15 | 99.197 | 116.463 |
| 12/2/15 | 99.116 | 116.678 |
| 12/3/15 | 98.476 | 116.209 |
| 12/4/15 | 98.55 | 115.723 |
| 12/7/15 | 98.714 | 114.95 |
| 12/8/15 | 98.535 | 113.929 |
| 12/9/15 | 98.493 | 113.937 |
| 12/10/15 | 98.415 | 113.616 |
| 12/11/15 | 98.408 | 112.053 |
| 12/14/15 | 97.875 | 110.398 |
| 12/15/15 | 97.724 | 111.331 |
| 12/16/15 | 97.692 | 111.756 |
| 12/17/15 | 97.923 | 111.719 |
| 12/18/15 | 98.016 | 110.876 |
| 12/21/15 | 98.036 | 110.761 |
| 12/22/15 | 97.906 | 111.06 |
| 12/23/15 | 97.884 | 111.633 |
| 12/24/15 | 97.951 | 111.817 |
| 12/28/15 | 98.048 | 111.751 |
| 12/29/15 | 97.858 | 112.132 |
| 12/30/15 | 97.834 | 112.194 |
| 12/31/15 | 97.954 | 112.164 |
| 1/4/16 | 97.954 | 111.61 |
| 1/5/16 | 97.883 | 112.157 |
| 1/6/16 | 98.075 | 112.146 |
| 1/7/16 | 98.019 | 111.674 |
| 1/8/16 | 98.141 | 111.833 |
| 1/11/16 | 97.966 | 111.469 |
| 1/12/16 | 97.968 | 111.045 |
| 1/13/16 | 97.973 | 110.498 |
| 1/14/16 | 97.726 | 109.605 |
| 1/15/16 | 97.656 | 108.22 |
| 1/19/16 | 97.422 | 106.701 |
| 1/20/16 | 97.151 | 104.751 |
| 1/21/16 | 97.215 | 105.29 |
| 1/22/16 | 97.163 | 106.657 |
| 1/25/16 | 97.159 | 106.911 |
| 1/26/16 | 97.197 | 107.204 |
| 1/27/16 | 97.048 | 107.442 |
| 1/28/16 | 97.129 | 107.959 |
| 1/29/16 | 97.357 | 108.363 |
| 2/1/16 | 97.19 | 108.18 |
| 2/2/16 | 97.337 | 107.497 |
| 2/3/16 | 97.327 | 107.249 |
| 2/4/16 | 97.387 | 107.393 |
| 2/5/16 | 97.392 | 106.952 |
| 2/8/16 | 97.497 | 105.276 |
| 2/9/16 | 97.38 | 104.63 |
| 2/10/16 | 97.494 | 105 |
| 2/11/16 | 97.536 | 103.609 |
| 2/12/16 | 97.221 | 104.265 |
| 2/16/16 | 96.823 | 105.687 |
| 2/17/16 | 96.752 | 106.697 |
| 2/18/16 | 97.125 | 107.321 |
| 2/19/16 | 97.184 | 107.105 |
| 2/22/16 | 97.277 | 107.702 |
| 2/23/16 | 97.403 | 107.614 |
| 2/24/16 | 97.493 | 107.304 |
| 2/25/16 | 97.671 | 107.935 |
| 2/26/16 | 97.635 | 108.879 |
| 2/29/16 | 97.849 | 109.804 |
| 3/1/16 | 97.704 | 110.942 |
| 3/2/16 | 97.698 | 111.706 |
| 3/3/16 | 97.916 | 112.167 |
| 3/4/16 | 97.913 | 113.082 |
| 3/7/16 | 98.053 | 113.458 |
| 3/8/16 | 98.473 | 112.986 |
| 3/9/16 | 98.318 | 112.846 |
| 3/10/16 | 98.368 | 113.184 |
| 3/11/16 | 98.541 | 114.211 |
| 3/14/16 | 98.884 | 114.51 |
| 3/15/16 | 98.904 | 114.043 |
| 3/16/16 | 98.905 | 113.864 |
| 3/17/16 | 99.356 | 114.716 |
| 3/18/16 | 99.586 | 115.523 |
| 3/21/16 | 99.581 | 115.663 |
| 3/22/16 | 99.59 | 115.435 |
| 3/23/16 | 99.727 | 115.115 |
| 3/24/16 | 99.659 | 114.191 |
| 3/28/16 | 99.666 | 113.974 |
| 3/29/16 | 99.821 | 113.52 |
| 3/30/16 | 99.914 | 114.159 |
| 3/31/16 | 100.16 | 114.42 |
| 4/1/16 | 100.239 | 114.414 |
| 4/4/16 | 100.344 | 114.445 |
| 4/5/16 | 100.51 | 113.977 |
| 4/6/16 | 100.402 | 114.326 |
| 4/7/16 | 100.595 | 114.184 |
| 4/8/16 | 100.553 | 114.388 |
| 4/11/16 | 100.536 | 114.726 |
| 4/12/16 | 100.422 | 115.276 |
| 4/13/16 | 100.523 | 116.313 |
| 4/14/16 | 100.553 | 116.732 |
| 4/15/16 | 100.795 | 116.767 |
| 4/18/16 | 100.717 | 116.694 |
| 4/19/16 | 100.914 | 117.525 |
| 4/20/16 | 100.969 | 118.048 |
| 4/21/16 | 100.831 | 118.202 |
| 4/22/16 | 100.819 | 118.149 |
| 4/25/16 | 100.752 | 117.862 |
| 4/26/16 | 100.613 | 118.006 |
| 4/27/16 | 100.75 | 118.405 |
| 4/28/16 | 100.971 | 118.933 |
| 4/29/16 | 101.057 | 118.977 |
| 5/2/16 | 100.972 | 118.989 |
| 5/3/16 | 101.105 | 118.358 |
| 5/4/16 | 100.988 | 118 |
| 5/5/16 | 101.081 | 117.869 |
| 5/6/16 | 100.977 | 117.444 |
| 5/9/16 | 100.928 | 117.376 |
| 5/10/16 | 100.974 | 117.498 |
| 5/11/16 | 101.032 | 117.891 |
| 5/12/16 | 100.877 | 118.018 |
| 5/13/16 | 100.95 | 117.876 |
| 5/16/16 | 100.827 | 118.086 |
| 5/17/16 | 100.809 | 118.204 |
| 5/18/16 | 100.373 | 118.032 |
| 5/19/16 | 100.166 | 117.415 |
| 5/20/16 | 100.176 | 117.792 |
| 5/23/16 | 100.188 | 117.807 |
| 5/24/16 | 100.101 | 117.977 |
| 5/25/16 | 100.192 | 118.409 |
| 5/26/16 | 100.45 | 118.541 |
| 5/27/16 | 100.506 | 118.585 |
| 5/31/16 | 100.47 | 118.559 |
| 6/1/16 | 100.493 | 118.352 |
| 6/2/16 | 100.662 | 118.563 |
| 6/3/16 | 101.087 | 118.704 |
| 6/6/16 | 101.088 | 119.22 |
| 6/7/16 | 101.226 | 119.692 |
| 6/8/16 | 101.365 | 120.306 |
| 6/9/16 | 101.487 | 120.209 |
| 6/10/16 | 101.496 | 119.766 |
| 6/13/16 | 101.487 | 119.446 |
| 6/14/16 | 101.329 | 118.664 |
| 6/15/16 | 101.419 | 118.829 |
| 6/16/16 | 101.489 | 118.23 |
| 6/17/16 | 101.401 | 118.77 |
| 6/20/16 | 101.327 | 119.641 |
| 6/21/16 | 101.29 | 119.573 |
| 6/22/16 | 101.359 | 119.983 |
| 6/23/16 | 101.335 | 120.37 |
| 6/24/16 | 101.522 | 119.364 |
| 6/27/16 | 101.852 | 118.321 |
| 6/28/16 | 102.038 | 118.764 |
| 6/29/16 | 102.242 | 119.679 |
| 6/30/16 | 102.263 | 120.071 |
| 7/1/16 | 102.602 | 120.728 |
| 7/5/16 | 103.03 | 120.715 |
| 7/6/16 | 103.096 | 120.597 |
| 7/7/16 | 103.202 | 121.055 |
| 7/8/16 | 103.443 | 121.566 |
| 7/11/16 | 103.472 | 122.378 |
| 7/12/16 | 103.204 | 123.104 |
| 7/13/16 | 103.367 | 122.802 |
| 7/14/16 | 103.127 | 123.13 |
| 7/15/16 | 102.886 | 123.011 |
| 7/18/16 | 102.841 | 122.979 |
| 7/19/16 | 102.936 | 122.968 |
| 7/20/16 | 102.851 | 123.102 |
| 7/21/16 | 102.9 | 123.186 |
| 7/22/16 | 102.963 | 123.151 |
| 7/25/16 | 102.905 | 123.163 |
| 7/26/16 | 102.742 | 122.864 |
| 7/27/16 | 102.84 | 122.804 |
| 7/28/16 | 102.876 | 122.636 |
| 7/29/16 | 103.038 | 122.399 |
| 8/1/16 | 102.887 | 122.327 |
| 8/2/16 | 102.539 | 121.987 |
| 8/3/16 | 102.504 | 122.144 |
| 8/4/16 | 102.848 | 122.718 |
| 8/5/16 | 102.692 | 123.146 |
| 8/8/16 | 102.723 | 123.464 |
| 8/9/16 | 102.899 | 123.896 |
| 8/10/16 | 103.176 | 123.947 |
| 8/11/16 | 103.017 | 123.908 |
| 8/12/16 | 103.238 | 124.104 |
| 8/15/16 | 103.08 | 124.345 |
| 8/16/16 | 103.077 | 124.48 |
| 8/17/16 | 103.089 | 124.378 |
| 8/18/16 | 103.264 | 124.419 |
| 8/19/16 | 103.14 | 124.527 |
| 8/22/16 | 103.33 | 124.449 |
| 8/23/16 | 103.408 | 124.567 |
| 8/24/16 | 103.36 | 124.527 |
| 8/25/16 | 103.219 | 124.364 |
| 8/26/16 | 103.182 | 124.463 |
| 8/29/16 | 103.212 | 124.508 |
| 8/30/16 | 103.254 | 124.565 |
| 8/31/16 | 103.204 | 124.444 |
| 9/1/16 | 103.106 | 124.275 |
| 9/2/16 | 103.02 | 124.482 |
| 9/6/16 | 103.173 | 124.57 |
| 9/7/16 | 103.214 | 124.769 |
| 9/8/16 | 102.844 | 124.765 |
| 9/9/16 | 102.316 | 124.169 |
| 9/12/16 | 102.142 | 123.817 |
| 9/13/16 | 101.89 | 123.406 |
| 9/14/16 | 101.934 | 123.322 |
| 9/15/16 | 101.875 | 123.342 |
| 9/16/16 | 101.964 | 123.323 |
| 9/19/16 | 101.972 | 123.381 |
| 9/20/16 | 102.086 | 123.37 |
| 9/21/16 | 102.085 | 123.718 |
| 9/22/16 | 102.565 | 124.528 |
| 9/23/16 | 102.627 | 124.463 |
| 9/26/16 | 102.662 | 124.311 |
| 9/27/16 | 102.729 | 124.202 |
| 9/28/16 | 102.795 | 124.501 |
| 9/29/16 | 102.757 | 124.732 |
| 9/30/16 | 102.664 | 124.902 |
| 10/3/16 | 102.561 | 124.974 |
| 10/4/16 | 102.348 | 125.042 |
| 10/5/16 | 102.133 | 125.154 |
| 10/6/16 | 102.123 | 125.243 |
| 10/7/16 | 102.143 | 125.303 |
| 10/10/16 | 102.15 | 125.35 |
| 10/11/16 | 102.031 | 125.271 |
| 10/12/16 | 101.979 | 125.249 |
| 10/13/16 | 102.181 | 125.06 |
| 10/14/16 | 102.049 | 125.313 |
| 10/17/16 | 102.116 | 125.403 |
| 10/18/16 | 102.243 | 125.59 |
| 10/19/16 | 102.331 | 125.904 |
| 10/20/16 | 102.341 | 126.012 |
| 10/21/16 | 102.286 | 126.004 |
| 10/24/16 | 102.156 | 126.084 |
| 10/25/16 | 102.106 | 126.031 |
| 10/26/16 | 101.852 | 125.645 |
| 10/27/16 | 101.515 | 125.294 |
| 10/28/16 | 101.435 | 125.038 |
| 10/31/16 | 101.431 | 124.615 |
| 11/1/16 | 101.273 | 123.926 |
| 11/2/16 | 101.354 | 123.269 |
| 11/3/16 | 101.293 | 123.356 |
| 11/4/16 | 101.395 | 123.256 |
| 11/7/16 | 101.386 | 123.972 |
| 11/8/16 | 101.271 | 124.022 |
| 11/9/16 | 100.589 | 123.549 |
| 11/10/16 | 100.282 | 122.922 |
| 11/11/16 | 100.288 | 122.849 |
| 11/14/16 | 99.481 | 121.393 |
| 11/15/16 | 99.542 | 122.154 |
| 11/16/16 | 99.526 | 122.299 |
| 11/17/16 | 99.292 | 122.572 |
| 11/18/16 | 98.92 | 122.404 |
| 11/21/16 | 98.856 | 122.543 |
| 11/22/16 | 98.95 | 122.907 |
| 11/23/16 | 98.65 | 122.942 |
| 11/25/16 | 98.709 | 122.939 |
| 11/28/16 | 98.919 | 123.06 |
| 11/29/16 | 98.971 | 122.942 |
| 11/30/16 | 98.83 | 123.153 |
| 12/1/16 | 98.527 | 123.047 |
| 12/2/16 | 98.798 | 123.085 |
| 12/5/16 | 98.825 | 123.35 |
| 12/6/16 | 98.837 | 123.66 |
| 12/7/16 | 99.082 | 124.346 |
| 12/8/16 | 98.897 | 124.442 |
| 12/9/16 | 98.652 | 124.634 |
| 12/12/16 | 98.532 | 124.706 |
| 12/13/16 | 98.641 | 124.826 |
| 12/14/16 | 98.708 | 124.841 |
| 12/15/16 | 98.218 | 124.209 |
| 12/16/16 | 98.231 | 124.196 |
| 12/19/16 | 98.398 | 124.25 |
| 12/20/16 | 98.342 | 124.323 |
| 12/21/16 | 98.52 | 124.401 |
| 12/22/16 | 98.526 | 124.557 |
| 12/23/16 | 98.608 | 124.7 |
| 12/27/16 | 98.599 | 124.757 |
| 12/28/16 | 98.772 | 124.979 |
| 12/29/16 | 99.053 | 125.079 |
| 12/30/16 | 99.166 | 125.024 |
| 1/3/17 | 99.167 | 125.29 |
| 1/4/17 | 99.324 | 125.718 |
| 1/5/17 | 99.629 | 126.08 |
| 1/6/17 | 99.465 | 126.222 |
| 1/9/17 | 99.562 | 126.301 |
| 1/10/17 | 99.502 | 126.358 |
| 1/11/17 | 99.52 | 126.215 |
| 1/12/17 | 99.682 | 126.236 |
| 1/13/17 | 99.426 | 126.315 |
| 1/17/17 | 99.431 | 126.442 |
| 1/18/17 | 99.159 | 126.34 |
| 1/19/17 | 98.789 | 126.091 |
| 1/20/17 | 98.753 | 126.016 |
| 1/23/17 | 99.094 | 125.997 |
| 1/24/17 | 98.935 | 126.138 |
| 1/25/17 | 98.694 | 126.299 |
| 1/26/17 | 98.686 | 126.427 |
| 1/27/17 | 98.832 | 126.533 |
| 1/30/17 | 98.744 | 126.442 |
| 1/31/17 | 98.822 | 126.428 |
| 2/1/17 | 98.666 | 126.54 |
| 2/2/17 | 98.834 | 126.71 |
| 2/3/17 | 98.938 | 126.997 |
| 2/6/17 | 99.073 | 127.105 |
| 2/7/17 | 99.167 | 127.032 |
| 2/8/17 | 99.313 | 126.779 |
| 2/9/17 | 99.148 | 126.792 |
| 2/10/17 | 99.072 | 127.001 |
| 2/13/17 | 99.019 | 127.148 |
| 2/14/17 | 98.891 | 127.17 |
| 2/15/17 | 98.774 | 127.135 |
| 2/16/17 | 99.017 | 127.143 |
| 2/17/17 | 99.152 | 127.164 |
| 2/21/17 | 99.158 | 127.417 |
| 2/22/17 | 99.179 | 127.596 |
| 2/23/17 | 99.392 | 127.788 |
| 2/24/17 | 99.66 | 127.755 |
| 2/27/17 | 99.612 | 127.849 |
| 2/28/17 | 99.611 | 127.865 |
| 3/1/17 | 99.147 | 128.167 |
| 3/2/17 | 99.036 | 128.03 |
| 3/3/17 | 99.029 | 127.88 |
| 3/6/17 | 98.999 | 127.582 |
| 3/7/17 | 98.792 | 127.155 |
| 3/8/17 | 98.418 | 126.57 |
| 3/9/17 | 98.122 | 125.801 |
| 3/10/17 | 98.185 | 125.997 |
| 3/13/17 | 98.066 | 125.711 |
| 3/14/17 | 98.01 | 125.195 |
| 3/15/17 | 98.242 | 125.611 |
| 3/16/17 | 98.512 | 126.437 |
| 3/17/17 | 98.636 | 126.374 |
| 3/20/17 | 98.731 | 126.207 |
| 3/21/17 | 98.926 | 125.972 |
| 3/22/17 | 99.036 | 125.486 |
| 3/23/17 | 99.008 | 125.659 |
| 3/24/17 | 99.092 | 125.92 |
| 3/27/17 | 99.203 | 125.816 |
| 3/28/17 | 99.135 | 126.205 |
| 3/29/17 | 99.22 | 126.619 |
| 3/30/17 | 99.134 | 127.017 |
| 3/31/17 | 99.12 | 127.191 |
| 4/3/17 | 99.352 | 127.242 |
| 4/4/17 | 99.346 | 127.214 |
| 4/5/17 | 99.341 | 127.433 |
| 4/6/17 | 99.373 | 127.467 |
| 4/7/17 | 99.424 | 127.55 |
| 4/10/17 | 99.36 | 127.557 |
| 4/11/17 | 99.58 | 127.584 |
| 4/12/17 | 99.7 | 127.45 |
| 4/13/17 | 99.828 | 127.43 |
| 4/17/17 | 99.864 | 127.372 |
| 4/18/17 | 100.048 | 127.28 |
| 4/19/17 | 99.994 | 127.383 |
| 4/20/17 | 99.833 | 127.38 |
| 4/21/17 | 99.919 | 127.467 |
| 4/24/17 | 99.724 | 127.614 |
| 4/25/17 | 99.581 | 127.691 |
| 4/26/17 | 99.546 | 127.769 |
| 4/27/17 | 99.683 | 127.81 |
| 4/28/17 | 99.68 | 127.918 |
| 5/1/17 | 99.61 | 127.928 |
| 5/2/17 | 99.679 | 128.036 |
| 5/3/17 | 99.773 | 127.994 |
| 5/4/17 | 99.494 | 127.57 |
| 5/5/17 | 99.528 | 127.458 |
| 5/8/17 | 99.422 | 127.476 |
| 5/9/17 | 99.348 | 127.426 |
| 5/10/17 | 99.464 | 127.493 |
| 5/11/17 | 99.465 | 127.549 |
| 5/12/17 | 99.771 | 127.84 |
| 5/15/17 | 99.83 | 127.994 |
| 5/16/17 | 99.908 | 128.044 |
| 5/17/17 | 100.232 | 127.918 |
| 5/18/17 | 100.236 | 127.513 |
| 5/19/17 | 100.22 | 127.878 |
| 5/22/17 | 100.234 | 128.008 |
| 5/23/17 | 100.12 | 128.02 |
| 5/24/17 | 100.026 | 128.117 |
| 5/25/17 | 100.058 | 128.192 |
| 5/26/17 | 100.179 | 128.198 |
| 5/30/17 | 100.268 | 128.276 |
| 5/31/17 | 100.336 | 128.216 |
| 6/1/17 | 100.29 | 128.298 |
| 6/2/17 | 100.573 | 128.473 |
| 6/5/17 | 100.532 | 128.426 |
| 6/6/17 | 100.701 | 128.409 |
| 6/7/17 | 100.598 | 128.271 |
| 6/8/17 | 100.441 | 128.001 |
| 6/9/17 | 100.364 | 128.01 |
| 6/12/17 | 100.371 | 128.036 |
| 6/13/17 | 100.379 | 128.163 |
| 6/14/17 | 100.791 | 128.27 |
| 6/15/17 | 100.673 | 128.1 |
| 6/16/17 | 100.717 | 128.006 |
| 6/19/17 | 100.641 | 127.995 |
| 6/20/17 | 100.724 | 127.654 |
| 6/21/17 | 100.732 | 127.349 |
| 6/22/17 | 100.78 | 127.197 |
| 6/23/17 | 100.807 | 127.322 |
| 6/26/17 | 100.948 | 127.512 |
| 6/27/17 | 100.676 | 127.503 |
| 6/28/17 | 100.616 | 127.544 |
| 6/29/17 | 100.472 | 127.522 |
| 6/30/17 | 100.444 | 127.575 |
| 7/3/17 | 100.327 | 127.582 |
| 7/5/17 | 100.249 | 127.495 |
| 7/6/17 | 100.103 | 127.207 |
| 7/7/17 | 100.053 | 126.98 |
| 7/10/17 | 100.159 | 127.021 |
| 7/11/17 | 100.16 | 127.037 |
| 7/12/17 | 100.413 | 127.393 |
| 7/13/17 | 100.316 | 127.41 |
| 7/14/17 | 100.475 | 127.671 |
| 7/17/17 | 100.512 | 127.906 |
| 7/18/17 | 100.747 | 128.014 |
| 7/19/17 | 100.793 | 128.2 |
| 7/20/17 | 100.882 | 128.363 |
| 7/21/17 | 101.003 | 128.319 |
| 7/24/17 | 100.907 | 128.32 |
| 7/25/17 | 100.593 | 128.264 |
| 7/26/17 | 100.617 | 128.423 |
| 7/27/17 | 100.612 | 128.402 |
| 7/28/17 | 100.698 | 128.427 |
| 7/31/17 | 100.712 | 128.375 |
| 8/1/17 | 100.858 | 128.429 |
| 8/2/17 | 100.869 | 128.446 |
| 8/3/17 | 100.91 | 128.372 |
| 8/4/17 | 100.719 | 128.226 |
| 8/7/17 | 100.69 | 128.247 |
| 8/8/17 | 100.529 | 128.057 |
| 8/9/17 | 100.501 | 127.577 |
| 8/10/17 | 100.444 | 127.161 |
| 8/11/17 | 100.428 | 127.045 |
| 8/14/17 | 100.51 | 127.316 |
| 8/15/17 | 100.408 | 127.277 |
| 8/16/17 | 100.511 | 127.325 |
| 8/17/17 | 100.625 | 127.225 |
| 8/18/17 | 100.649 | 126.998 |
| 8/21/17 | 100.662 | 127.05 |
| 8/22/17 | 100.58 | 127.155 |
| 8/23/17 | 100.707 | 127.154 |
| 8/24/17 | 100.702 | 127.322 |
| 8/25/17 | 100.766 | 127.444 |
| 8/28/17 | 100.811 | 127.519 |
| 8/29/17 | 100.91 | 127.551 |
| 8/30/17 | 100.866 | 127.652 |
| 8/31/17 | 100.955 | 127.923 |
| 9/1/17 | 100.918 | 128.046 |
| 9/5/17 | 101.116 | 128.11 |
| 9/6/17 | 101.064 | 128.114 |
| 9/7/17 | 101.148 | 128.098 |
| 9/8/17 | 101.061 | 127.96 |
| 9/11/17 | 100.823 | 127.908 |
| 9/12/17 | 100.676 | 127.893 |
| 9/13/17 | 100.664 | 127.977 |
| 9/14/17 | 100.655 | 128.006 |
| 9/15/17 | 100.738 | 128.012 |
| 9/18/17 | 100.691 | 128.097 |
| 9/19/17 | 100.71 | 128.152 |
| 9/20/17 | 100.669 | 128.143 |
| 9/21/17 | 100.604 | 128.023 |
| 9/22/17 | 100.65 | 128.083 |
| 9/25/17 | 100.805 | 128.129 |
| 9/26/17 | 100.807 | 128.234 |
| 9/27/17 | 100.562 | 128.132 |
| 9/28/17 | 100.593 | 128.209 |
| 9/29/17 | 100.721 | 128.376 |
| 10/2/17 | 100.746 | 128.389 |
| 10/3/17 | 100.834 | 128.512 |
| 10/4/17 | 100.794 | 128.503 |
| 10/5/17 | 100.73 | 128.568 |
| 10/6/17 | 100.629 | 128.471 |
| 10/9/17 | 100.645 | 128.493 |
| 10/10/17 | 100.736 | 128.533 |
| 10/11/17 | 100.693 | 128.507 |
| 10/12/17 | 100.668 | 128.408 |
| 10/13/17 | 100.881 | 128.399 |
| 10/16/17 | 100.84 | 128.461 |
| 10/17/17 | 100.795 | 128.526 |
| 10/18/17 | 100.661 | 128.534 |
| 10/19/17 | 100.761 | 128.61 |
| 10/20/17 | 100.579 | 128.587 |
| 10/23/17 | 100.646 | 128.657 |
| 10/24/17 | 100.499 | 128.553 |
| 10/25/17 | 100.282 | 128.267 |
| 10/26/17 | 100.274 | 128.238 |
| 10/27/17 | 100.354 | 128.165 |
| 10/30/17 | 100.557 | 128.146 |
| 10/31/17 | 100.509 | 128.181 |
| 11/1/17 | 100.558 | 128.202 |
| 11/2/17 | 100.534 | 128.091 |
| 11/3/17 | 100.544 | 128.096 |
| 11/6/17 | 100.546 | 127.944 |
| 11/7/17 | 100.462 | 127.761 |
| 11/8/17 | 100.402 | 127.309 |
| 11/9/17 | 100.215 | 126.763 |
| 11/10/17 | 99.868 | 126.665 |
| 11/13/17 | 99.862 | 126.59 |
| 11/14/17 | 99.872 | 126.281 |
| 11/15/17 | 99.956 | 125.912 |
| 11/16/17 | 99.994 | 126.616 |
| 11/17/17 | 100.092 | 126.74 |
| 11/20/17 | 100.053 | 126.791 |
| 11/21/17 | 100.208 | 126.93 |
| 11/22/17 | 100.355 | 127.049 |
| 11/24/17 | 100.398 | 127.165 |
| 11/27/17 | 100.38 | 127.179 |
| 11/28/17 | 100.434 | 127.171 |
| 11/29/17 | 100.207 | 127.16 |
| 11/30/17 | 100.115 | 127.119 |
| 12/1/17 | 100.319 | 127.199 |
| 12/4/17 | 100.297 | 127.193 |
| 12/5/17 | 100.413 | 127.273 |
| 12/6/17 | 100.604 | 127.188 |
| 12/7/17 | 100.463 | 127.047 |
| 12/8/17 | 100.326 | 126.989 |
| 12/11/17 | 100.36 | 126.978 |
| 12/12/17 | 100.255 | 127.021 |
| 12/13/17 | 100.446 | 127.08 |
| 12/14/17 | 100.569 | 127.054 |
| 12/15/17 | 100.606 | 127 |
| 12/18/17 | 100.509 | 126.871 |
| 12/19/17 | 100.19 | 126.797 |
| 12/20/17 | 99.99 | 126.652 |
| 12/21/17 | 100.044 | 126.725 |
| 12/22/17 | 100.072 | 126.741 |
| 12/26/17 | 100.134 | 126.789 |
| 12/27/17 | 100.395 | 126.782 |
| 12/28/17 | 100.493 | 126.924 |
| 12/29/17 | 100.537 | 126.974 |